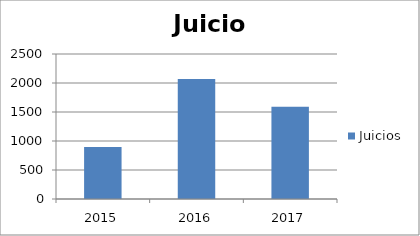
| Category | Juicios |
|---|---|
| 2015.0 | 895 |
| 2016.0 | 2071 |
| 2017.0 | 1590 |